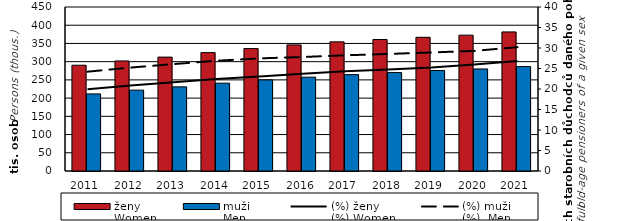
| Category | ženy  
Women | muži  
Men |
|---|---|---|
| 2011.0 | 290224 | 211565 |
| 2012.0 | 301986 | 221900 |
| 2013.0 | 312495 | 230861 |
| 2014.0 | 324865 | 241061 |
| 2015.0 | 335915 | 250094 |
| 2016.0 | 346027 | 257474 |
| 2017.0 | 354331 | 264511 |
| 2018.0 | 360801 | 270095 |
| 2019.0 | 366846 | 275790 |
| 2020.0 | 372810 | 280034 |
| 2021.0 | 381636 | 286520 |